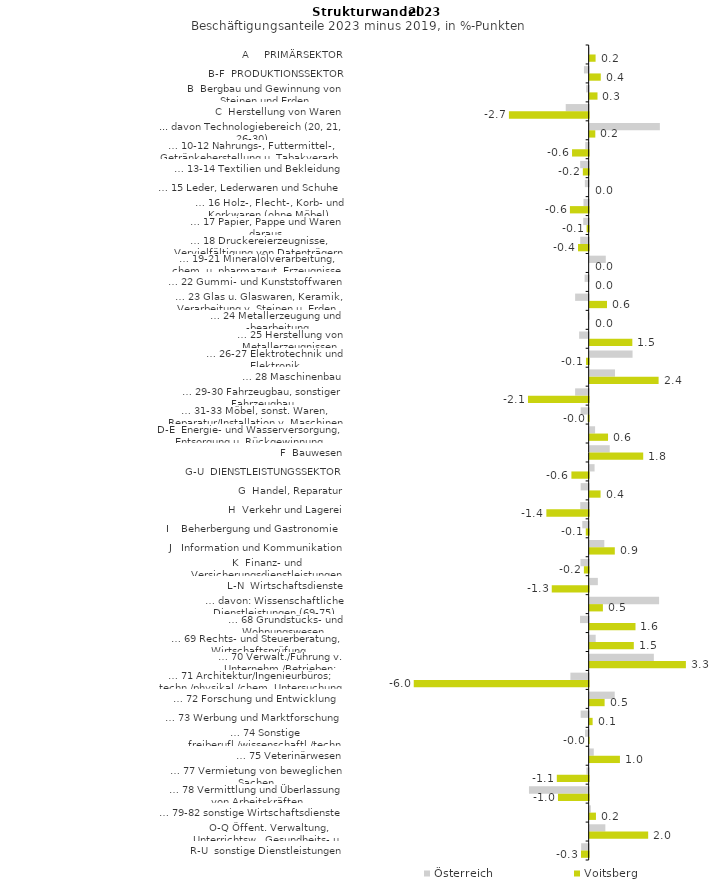
| Category | Österreich | Voitsberg |
|---|---|---|
| A     PRIMÄRSEKTOR | -0.007 | 0.202 |
| B-F  PRODUKTIONSSEKTOR | -0.161 | 0.379 |
| B  Bergbau und Gewinnung von Steinen und Erden | -0.086 | 0.267 |
| C  Herstellung von Waren | -0.782 | -2.718 |
| ... davon Technologiebereich (20, 21, 26-30) | 2.393 | 0.192 |
| … 10-12 Nahrungs-, Futtermittel-, Getränkeherstellung u. Tabakverarb. | -0.116 | -0.567 |
| … 13-14 Textilien und Bekleidung | -0.289 | -0.199 |
| … 15 Leder, Lederwaren und Schuhe | -0.13 | 0 |
| … 16 Holz-, Flecht-, Korb- und Korkwaren (ohne Möbel)  | -0.177 | -0.639 |
| … 17 Papier, Pappe und Waren daraus  | -0.185 | -0.07 |
| … 18 Druckereierzeugnisse, Vervielfältigung von Datenträgern | -0.288 | -0.364 |
| … 19-21 Mineralölverarbeitung, chem. u. pharmazeut. Erzeugnisse | 0.549 | 0 |
| … 22 Gummi- und Kunststoffwaren | -0.139 | 0 |
| … 23 Glas u. Glaswaren, Keramik, Verarbeitung v. Steinen u. Erden  | -0.462 | 0.59 |
| … 24 Metallerzeugung und -bearbeitung | -0.032 | 0 |
| … 25 Herstellung von Metallerzeugnissen  | -0.325 | 1.455 |
| … 26-27 Elektrotechnik und Elektronik | 1.462 | -0.089 |
| … 28 Maschinenbau | 0.864 | 2.35 |
| … 29-30 Fahrzeugbau, sonstiger Fahrzeugbau | -0.462 | -2.069 |
| … 31-33 Möbel, sonst. Waren, Reparatur/Installation v. Maschinen | -0.273 | -0.034 |
| D-E  Energie- und Wasserversorgung, Entsorgung u. Rückgewinnung | 0.184 | 0.626 |
| F  Bauwesen | 0.684 | 1.825 |
| G-U  DIENSTLEISTUNGSSEKTOR | 0.167 | -0.588 |
| G  Handel, Reparatur | -0.273 | 0.372 |
| H  Verkehr und Lagerei | -0.287 | -1.442 |
| I    Beherbergung und Gastronomie | -0.218 | -0.098 |
| J   Information und Kommunikation | 0.499 | 0.857 |
| K  Finanz- und Versicherungsdienstleistungen | -0.279 | -0.163 |
| L-N  Wirtschaftsdienste | 0.279 | -1.258 |
| … davon: Wissenschaftliche Dienstleistungen (69-75) | 2.367 | 0.451 |
| … 68 Grundstücks- und Wohnungswesen  | -0.294 | 1.562 |
| … 69 Rechts- und Steuerberatung, Wirtschaftsprüfung | 0.205 | 1.505 |
| … 70 Verwalt./Führung v. Unternehm./Betrieben; Unternehmensberat. | 2.188 | 3.28 |
| … 71 Architektur/Ingenieurbüros; techn./physikal./chem. Untersuchung | -0.622 | -5.963 |
| … 72 Forschung und Entwicklung  | 0.854 | 0.51 |
| … 73 Werbung und Marktforschung | -0.273 | 0.101 |
| … 74 Sonstige freiberufl./wissenschaftl./techn. Tätigkeiten | -0.124 | -0.013 |
| … 75 Veterinärwesen | 0.14 | 1.032 |
| … 77 Vermietung von beweglichen Sachen  | -0.077 | -1.086 |
| … 78 Vermittlung und Überlassung von Arbeitskräften | -2.035 | -1.047 |
| … 79-82 sonstige Wirtschaftsdienste | 0.039 | 0.214 |
| O-Q Öffent. Verwaltung, Unterrichtsw., Gesundheits- u. Sozialwesen | 0.535 | 1.994 |
| R-U  sonstige Dienstleistungen | -0.256 | -0.261 |